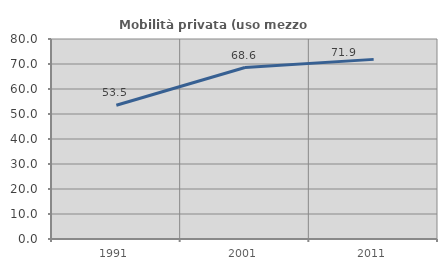
| Category | Mobilità privata (uso mezzo privato) |
|---|---|
| 1991.0 | 53.479 |
| 2001.0 | 68.598 |
| 2011.0 | 71.85 |